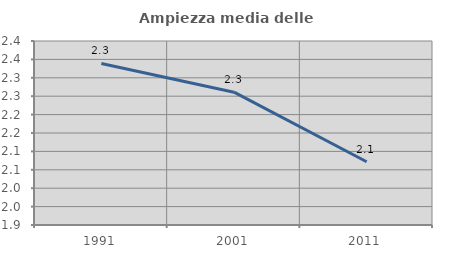
| Category | Ampiezza media delle famiglie |
|---|---|
| 1991.0 | 2.339 |
| 2001.0 | 2.261 |
| 2011.0 | 2.072 |